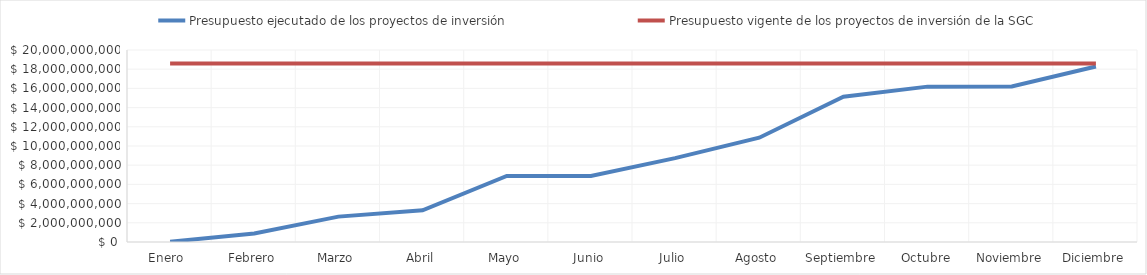
| Category | Presupuesto ejecutado de los proyectos de inversión | Presupuesto vigente de los proyectos de inversión de la SGC |
|---|---|---|
| Enero  | 31560000 | 18591084560 |
| Febrero | 880745716 | 18591084560 |
| Marzo | 2643653567 | 18591084560 |
| Abril | 3301607825 | 18591084560 |
| Mayo | 6884621463 | 18591084560 |
| Junio | 6884621463 | 18591084560 |
| Julio | 8733734313 | 18591084560 |
| Agosto | 10862033243 | 18591084560 |
| Septiembre | 15124188119 | 18591084560 |
| Octubre | 16184778278 | 18591084560 |
| Noviembre | 16191691585 | 18591084560 |
| Diciembre | 18274806841 | 18591084560 |